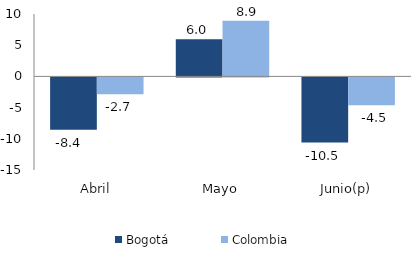
| Category | Bogotá | Colombia |
|---|---|---|
| Abril | -8.397 | -2.703 |
| Mayo | 5.951 | 8.927 |
| Junio(p) | -10.451 | -4.453 |